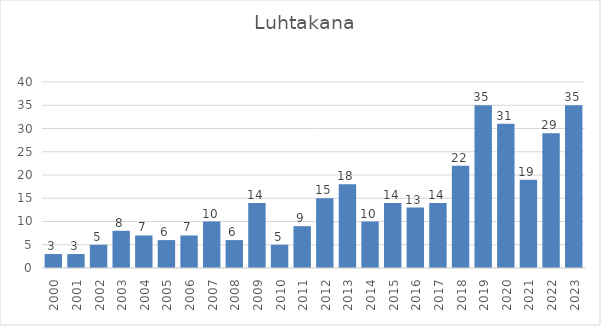
| Category | Series 0 |
|---|---|
| 2000.0 | 3 |
| 2001.0 | 3 |
| 2002.0 | 5 |
| 2003.0 | 8 |
| 2004.0 | 7 |
| 2005.0 | 6 |
| 2006.0 | 7 |
| 2007.0 | 10 |
| 2008.0 | 6 |
| 2009.0 | 14 |
| 2010.0 | 5 |
| 2011.0 | 9 |
| 2012.0 | 15 |
| 2013.0 | 18 |
| 2014.0 | 10 |
| 2015.0 | 14 |
| 2016.0 | 13 |
| 2017.0 | 14 |
| 2018.0 | 22 |
| 2019.0 | 35 |
| 2020.0 | 31 |
| 2021.0 | 19 |
| 2022.0 | 29 |
| 2023.0 | 35 |